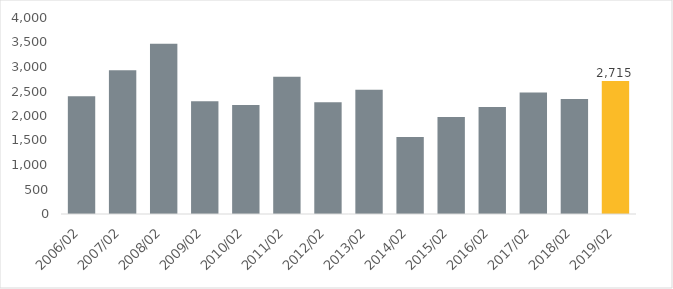
| Category | Series 0 |
|---|---|
| 2006/02 | 2402.222 |
| 2007/02 | 2934.822 |
| 2008/02 | 3472.022 |
| 2009/02 | 2302.389 |
| 2010/02 | 2225.876 |
| 2011/02 | 2800.519 |
| 2012/02 | 2279.518 |
| 2013/02 | 2535.187 |
| 2014/02 | 1571.134 |
| 2015/02 | 1981.291 |
| 2016/02 | 2184.191 |
| 2017/02 | 2481.909 |
| 2018/02 | 2348.874 |
| 2019/02 | 2714.678 |